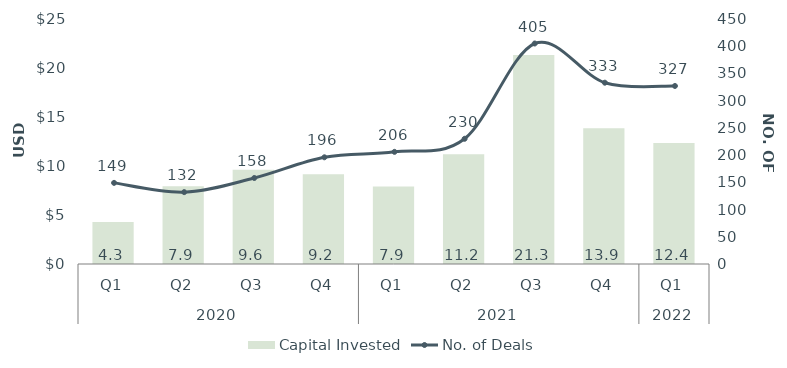
| Category | Capital Invested |
|---|---|
| 0 | 4.287 |
| 1 | 7.93 |
| 2 | 9.62 |
| 3 | 9.156 |
| 4 | 7.908 |
| 5 | 11.188 |
| 6 | 21.315 |
| 7 | 13.857 |
| 8 | 12.352 |